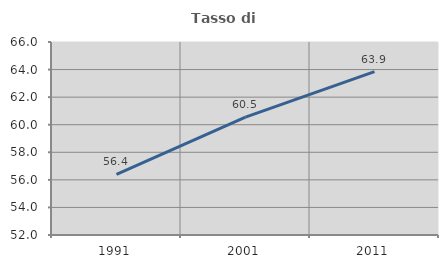
| Category | Tasso di occupazione   |
|---|---|
| 1991.0 | 56.398 |
| 2001.0 | 60.545 |
| 2011.0 | 63.857 |